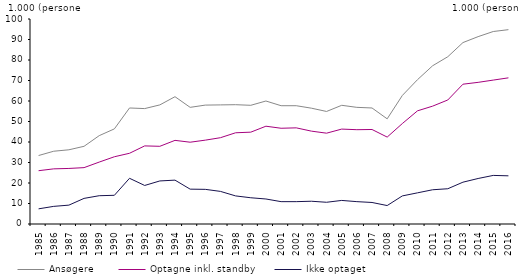
| Category | Ansøgere | Optagne inkl. standby | Ikke optaget |
|---|---|---|---|
| 1985.0 | 33.4 | 26 | 7.4 |
| 1986.0 | 35.5 | 26.9 | 8.6 |
| 1987.0 | 36.2 | 27.1 | 9.2 |
| 1988.0 | 37.9 | 27.5 | 12.5 |
| 1989.0 | 43.1 | 30.2 | 13.8 |
| 1990.0 | 46.4 | 32.8 | 14 |
| 1991.0 | 56.6 | 34.5 | 22.3 |
| 1992.0 | 56.3 | 38.1 | 18.8 |
| 1993.0 | 58.1 | 37.9 | 21 |
| 1994.0 | 62.1 | 40.8 | 21.4 |
| 1995.0 | 56.9 | 39.9 | 17 |
| 1996.0 | 58 | 40.9 | 16.9 |
| 1997.0 | 58.1 | 42.1 | 15.9 |
| 1998.0 | 58.2 | 44.5 | 13.7 |
| 1999.0 | 57.9 | 44.8 | 12.8 |
| 2000.0 | 60 | 47.7 | 12.2 |
| 2001.0 | 57.7 | 46.7 | 10.9 |
| 2002.0 | 57.7 | 46.9 | 10.9 |
| 2003.0 | 56.5 | 45.3 | 11.1 |
| 2004.0 | 54.9 | 44.3 | 10.6 |
| 2005.0 | 57.9 | 46.3 | 11.5 |
| 2006.0 | 56.9 | 46 | 10.9 |
| 2007.0 | 56.6 | 46.1 | 10.5 |
| 2008.0 | 51.3 | 42.4 | 9 |
| 2009.0 | 62.7 | 49 | 13.7 |
| 2010.0 | 70.4 | 55.2 | 15.2 |
| 2011.0 | 77.2 | 57.5 | 16.7 |
| 2012.0 | 81.6 | 60.5 | 17.2 |
| 2013.0 | 88.5 | 68.2 | 20.4 |
| 2014.0 | 91.4 | 69.1 | 22.2 |
| 2015.0 | 93.9 | 70.2 | 23.7 |
| 2016.0 | 94.8 | 71.3 | 23.5 |